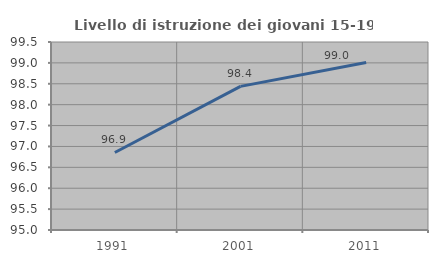
| Category | Livello di istruzione dei giovani 15-19 anni |
|---|---|
| 1991.0 | 96.855 |
| 2001.0 | 98.438 |
| 2011.0 | 99.01 |